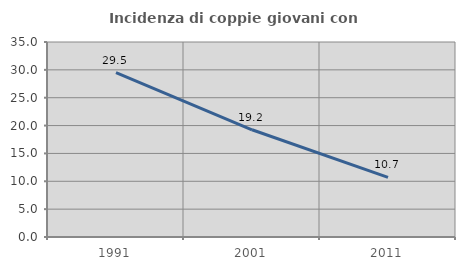
| Category | Incidenza di coppie giovani con figli |
|---|---|
| 1991.0 | 29.522 |
| 2001.0 | 19.249 |
| 2011.0 | 10.695 |